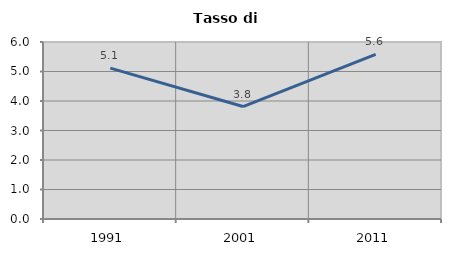
| Category | Tasso di disoccupazione   |
|---|---|
| 1991.0 | 5.115 |
| 2001.0 | 3.812 |
| 2011.0 | 5.582 |